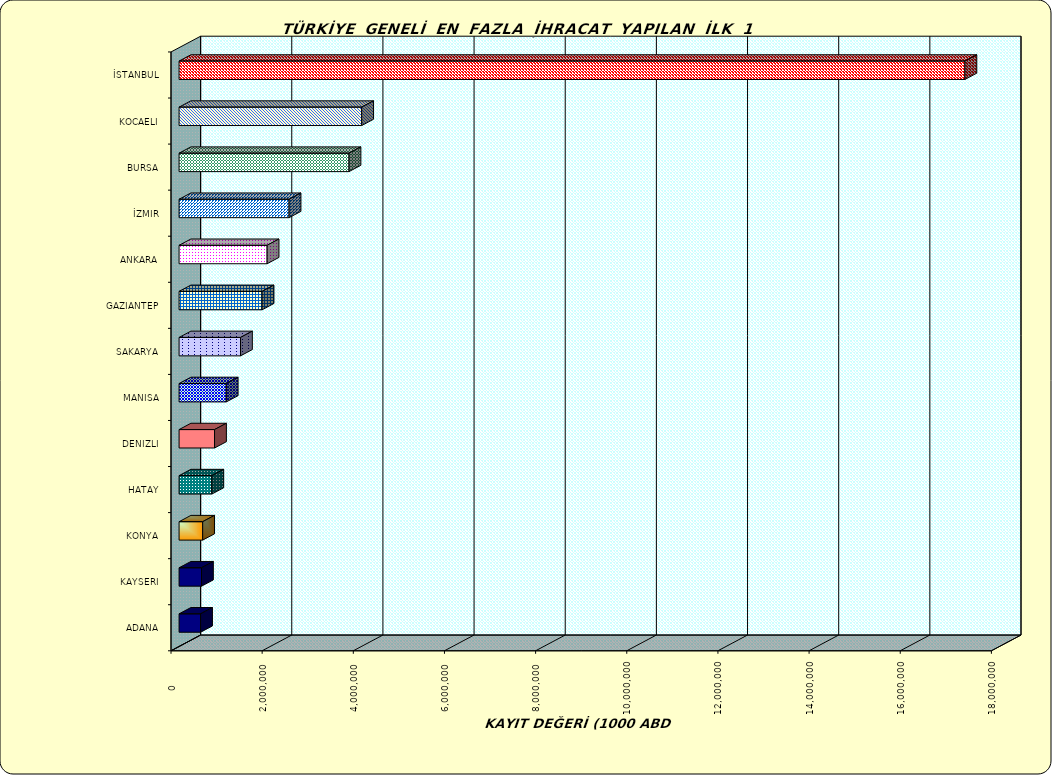
| Category | Series 0 |
|---|---|
| İSTANBUL | 17242098.433 |
| KOCAELI | 4006698.651 |
| BURSA | 3728819.736 |
| İZMIR | 2413556.771 |
| ANKARA | 1931569.349 |
| GAZIANTEP | 1821345.257 |
| SAKARYA | 1347797.23 |
| MANISA | 1035318.772 |
| DENIZLI | 778173.499 |
| HATAY | 718888.132 |
| KONYA | 517862.551 |
| KAYSERI | 492274.31 |
| ADANA | 472054.069 |